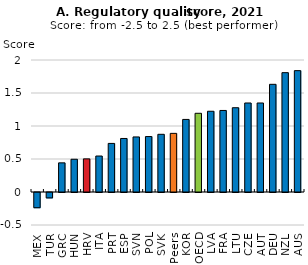
| Category | Regulatory quality |
|---|---|
| MEX | -0.231 |
| TUR | -0.082 |
| GRC | 0.442 |
| HUN | 0.496 |
| HRV | 0.502 |
| ITA | 0.545 |
| PRT | 0.736 |
| ESP | 0.811 |
| SVN | 0.834 |
| POL | 0.84 |
| SVK | 0.874 |
| Peers | 0.888 |
| KOR | 1.1 |
| OECD | 1.193 |
| LVA | 1.223 |
| FRA | 1.236 |
| LTU | 1.277 |
| CZE | 1.349 |
| AUT | 1.349 |
| DEU | 1.632 |
| NZL | 1.808 |
| AUS | 1.839 |